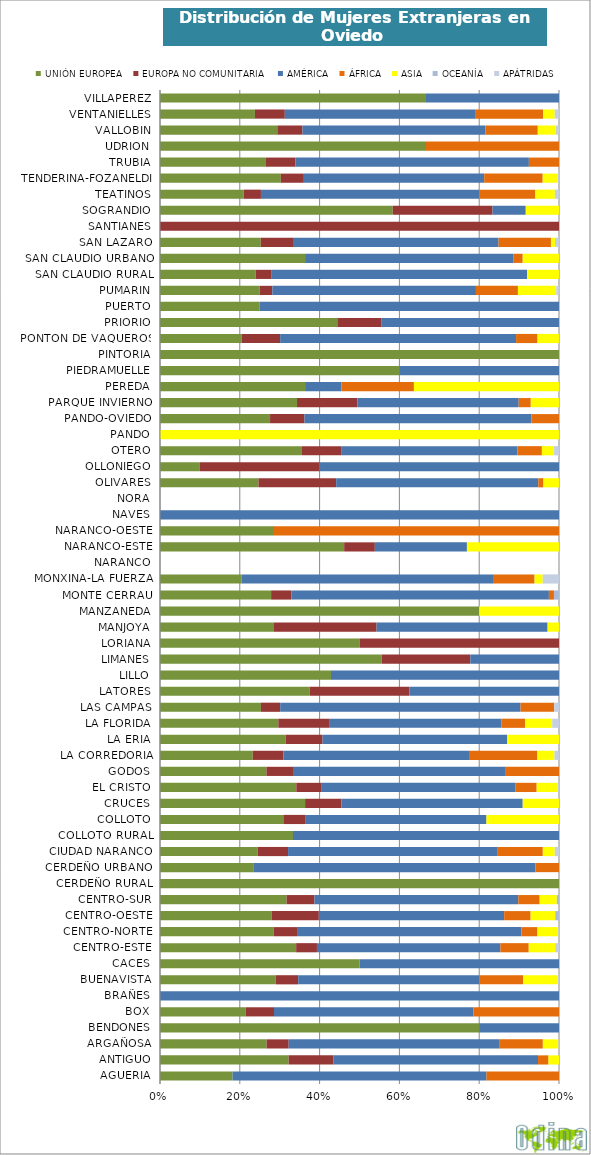
| Category | UNIÓN EUROPEA | EUROPA NO COMUNITARIA | AMÉRICA | ÁFRICA | ASIA | OCEANÍA | APÁTRIDAS |
|---|---|---|---|---|---|---|---|
| AGUERIA | 0.182 | 0 | 0.636 | 0.182 | 0 | 0 | 0 |
| ANTIGUO | 0.322 | 0.112 | 0.513 | 0.026 | 0.026 | 0 | 0 |
| ARGAÑOSA | 0.267 | 0.055 | 0.529 | 0.108 | 0.039 | 0 | 0.001 |
| BENDONES | 0.8 | 0 | 0.2 | 0 | 0 | 0 | 0 |
| BOX | 0.214 | 0.071 | 0.5 | 0.214 | 0 | 0 | 0 |
| BRAÑES | 0 | 0 | 1 | 0 | 0 | 0 | 0 |
| BUENAVISTA | 0.29 | 0.056 | 0.454 | 0.11 | 0.088 | 0 | 0.002 |
| CACES | 0.5 | 0 | 0.5 | 0 | 0 | 0 | 0 |
| CENTRO-ESTE | 0.341 | 0.052 | 0.46 | 0.071 | 0.066 | 0 | 0.009 |
| CENTRO-NORTE | 0.285 | 0.059 | 0.562 | 0.04 | 0.052 | 0 | 0.002 |
| CENTRO-OESTE | 0.28 | 0.118 | 0.464 | 0.066 | 0.062 | 0.009 | 0 |
| CENTRO-SUR | 0.317 | 0.07 | 0.511 | 0.054 | 0.043 | 0.005 | 0 |
| CERDEÑO RURAL | 1 | 0 | 0 | 0 | 0 | 0 | 0 |
| CERDEÑO URBANO | 0.235 | 0 | 0.706 | 0.059 | 0 | 0 | 0 |
| CIUDAD NARANCO | 0.245 | 0.076 | 0.526 | 0.113 | 0.03 | 0 | 0.011 |
| COLLOTO RURAL | 0.333 | 0 | 0.667 | 0 | 0 | 0 | 0 |
| COLLOTO | 0.309 | 0.055 | 0.455 | 0 | 0.182 | 0 | 0 |
| CRUCES | 0.364 | 0.091 | 0.455 | 0 | 0.091 | 0 | 0 |
| EL CRISTO | 0.342 | 0.062 | 0.488 | 0.053 | 0.053 | 0 | 0.003 |
| GODOS | 0.267 | 0.067 | 0.533 | 0.133 | 0 | 0 | 0 |
| LA CORREDORIA | 0.233 | 0.077 | 0.467 | 0.169 | 0.043 | 0 | 0.011 |
| LA ERIA | 0.315 | 0.093 | 0.463 | 0 | 0.13 | 0 | 0 |
| LA FLORIDA | 0.297 | 0.127 | 0.432 | 0.059 | 0.068 | 0 | 0.017 |
| LAS CAMPAS | 0.253 | 0.048 | 0.602 | 0.084 | 0 | 0 | 0.012 |
| LATORES | 0.375 | 0.25 | 0.375 | 0 | 0 | 0 | 0 |
| LILLO | 0.429 | 0 | 0.571 | 0 | 0 | 0 | 0 |
| LIMANES | 0.556 | 0.222 | 0.222 | 0 | 0 | 0 | 0 |
| LORIANA | 0.5 | 0.5 | 0 | 0 | 0 | 0 | 0 |
| MANJOYA | 0.286 | 0.257 | 0.429 | 0 | 0.029 | 0 | 0 |
| MANZANEDA | 0.8 | 0 | 0 | 0 | 0.2 | 0 | 0 |
| MONTE CERRAU | 0.278 | 0.051 | 0.646 | 0.013 | 0 | 0.013 | 0 |
| MONXINA-LA FUERZA | 0.204 | 0 | 0.633 | 0.102 | 0.02 | 0 | 0.041 |
| NARANCO | 0 | 0 | 0 | 0 | 0 | 0 | 0 |
| NARANCO-ESTE | 0.462 | 0.077 | 0.231 | 0 | 0.231 | 0 | 0 |
| NARANCO-OESTE | 0.286 | 0 | 0 | 0.714 | 0 | 0 | 0 |
| NAVES | 0 | 0 | 1 | 0 | 0 | 0 | 0 |
| NORA | 0 | 0 | 0 | 0 | 0 | 0 | 0 |
| OLIVARES | 0.247 | 0.195 | 0.506 | 0.013 | 0.039 | 0 | 0 |
| OLLONIEGO | 0.1 | 0.3 | 0.6 | 0 | 0 | 0 | 0 |
| OTERO | 0.356 | 0.098 | 0.442 | 0.061 | 0.031 | 0 | 0.012 |
| PANDO | 0 | 0 | 0 | 0 | 1 | 0 | 0 |
| PANDO-OVIEDO | 0.276 | 0.086 | 0.569 | 0.069 | 0 | 0 | 0 |
| PARQUE INVIERNO | 0.343 | 0.152 | 0.404 | 0.03 | 0.071 | 0 | 0 |
| PEREDA | 0.364 | 0 | 0.091 | 0.182 | 0.364 | 0 | 0 |
| PIEDRAMUELLE | 0.6 | 0 | 0.4 | 0 | 0 | 0 | 0 |
| PINTORIA | 1 | 0 | 0 | 0 | 0 | 0 | 0 |
| PONTON DE VAQUEROS | 0.204 | 0.097 | 0.591 | 0.054 | 0.054 | 0 | 0 |
| PRIORIO | 0.444 | 0.111 | 0.444 | 0 | 0 | 0 | 0 |
| PUERTO | 0.25 | 0 | 0.75 | 0 | 0 | 0 | 0 |
| PUMARIN | 0.25 | 0.032 | 0.51 | 0.105 | 0.096 | 0 | 0.007 |
| SAN CLAUDIO RURAL | 0.24 | 0.04 | 0.64 | 0 | 0.08 | 0 | 0 |
| SAN CLAUDIO URBANO | 0.364 | 0 | 0.523 | 0.023 | 0.091 | 0 | 0 |
| SAN LAZARO | 0.253 | 0.081 | 0.515 | 0.131 | 0.01 | 0 | 0.01 |
| SANTIANES | 0 | 1 | 0 | 0 | 0 | 0 | 0 |
| SOGRANDIO | 0.583 | 0.25 | 0.083 | 0 | 0.083 | 0 | 0 |
| TEATINOS | 0.21 | 0.043 | 0.547 | 0.141 | 0.049 | 0 | 0.01 |
| TENDERINA-FOZANELDI | 0.303 | 0.058 | 0.452 | 0.147 | 0.038 | 0 | 0.002 |
| TRUBIA | 0.264 | 0.075 | 0.585 | 0.075 | 0 | 0 | 0 |
| UDRION | 0.667 | 0 | 0 | 0.333 | 0 | 0 | 0 |
| VALLOBIN | 0.294 | 0.063 | 0.458 | 0.131 | 0.047 | 0.002 | 0.005 |
| VENTANIELLES | 0.238 | 0.075 | 0.479 | 0.168 | 0.029 | 0 | 0.011 |
| VILLAPEREZ | 0.667 | 0 | 0.333 | 0 | 0 | 0 | 0 |